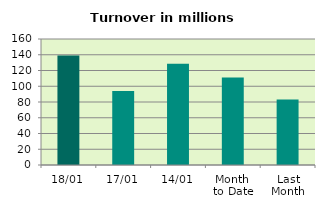
| Category | Series 0 |
|---|---|
| 18/01 | 139.013 |
| 17/01 | 93.965 |
| 14/01 | 128.547 |
| Month 
to Date | 111.219 |
| Last
Month | 83.19 |